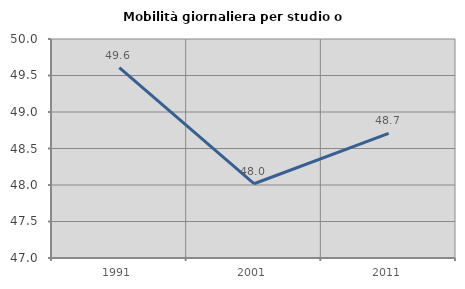
| Category | Mobilità giornaliera per studio o lavoro |
|---|---|
| 1991.0 | 49.609 |
| 2001.0 | 48.017 |
| 2011.0 | 48.706 |